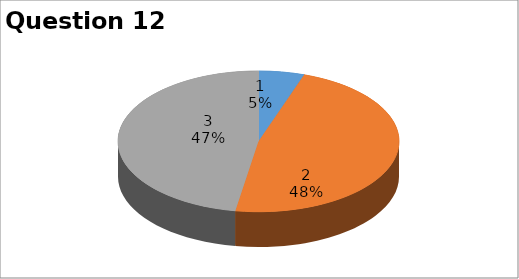
| Category | Series 0 |
|---|---|
| 0 | 1 |
| 1 | 9 |
| 2 | 9 |